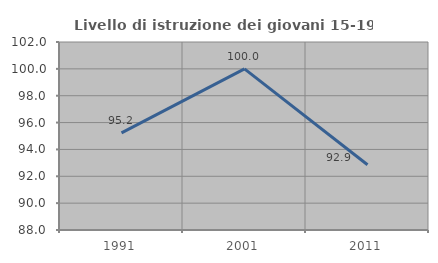
| Category | Livello di istruzione dei giovani 15-19 anni |
|---|---|
| 1991.0 | 95.238 |
| 2001.0 | 100 |
| 2011.0 | 92.857 |